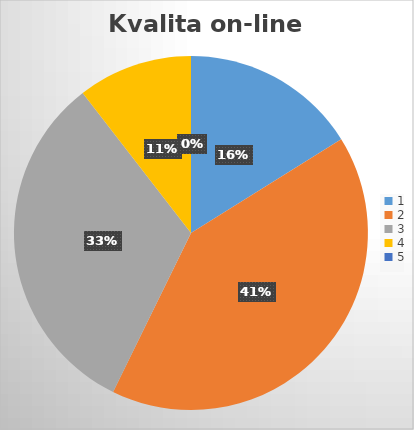
| Category | Series 0 |
|---|---|
| 0 | 20 |
| 1 | 51 |
| 2 | 40 |
| 3 | 13 |
| 4 | 0 |